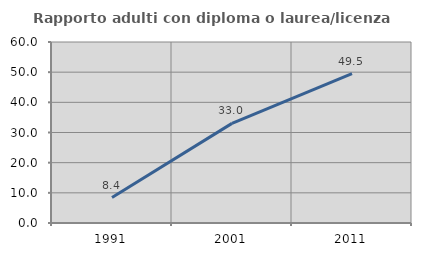
| Category | Rapporto adulti con diploma o laurea/licenza media  |
|---|---|
| 1991.0 | 8.421 |
| 2001.0 | 33.019 |
| 2011.0 | 49.485 |